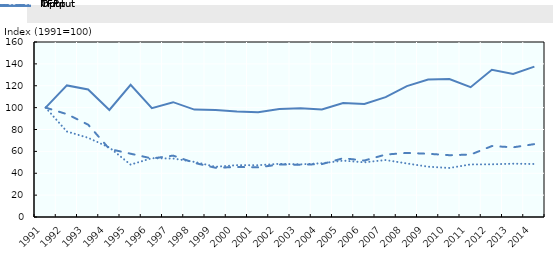
| Category | TFP | Output | Input |
|---|---|---|---|
| 1991.0 | 100 | 100 | 100 |
| 1992.0 | 120.29 | 94.043 | 78.18 |
| 1993.0 | 116.646 | 84.445 | 72.394 |
| 1994.0 | 97.876 | 62.2 | 63.55 |
| 1995.0 | 120.797 | 57.853 | 47.893 |
| 1996.0 | 99.531 | 53.518 | 53.77 |
| 1997.0 | 104.978 | 56.128 | 53.466 |
| 1998.0 | 98.182 | 49.469 | 50.385 |
| 1999.0 | 97.907 | 44.973 | 45.934 |
| 2000.0 | 96.542 | 45.748 | 47.387 |
| 2001.0 | 95.882 | 45.391 | 47.34 |
| 2002.0 | 98.644 | 47.966 | 48.626 |
| 2003.0 | 99.404 | 47.838 | 48.125 |
| 2004.0 | 98.397 | 48.344 | 49.132 |
| 2005.0 | 104.194 | 53.719 | 51.557 |
| 2006.0 | 103.295 | 51.624 | 49.977 |
| 2007.0 | 109.616 | 57.081 | 52.074 |
| 2008.0 | 119.696 | 58.595 | 48.953 |
| 2009.0 | 125.662 | 57.81 | 46.004 |
| 2010.0 | 126.067 | 56.508 | 44.824 |
| 2011.0 | 118.685 | 57.05 | 48.068 |
| 2012.0 | 134.651 | 64.867 | 48.174 |
| 2013.0 | 130.732 | 63.702 | 48.727 |
| 2014.0 | 137.506 | 66.633 | 48.458 |